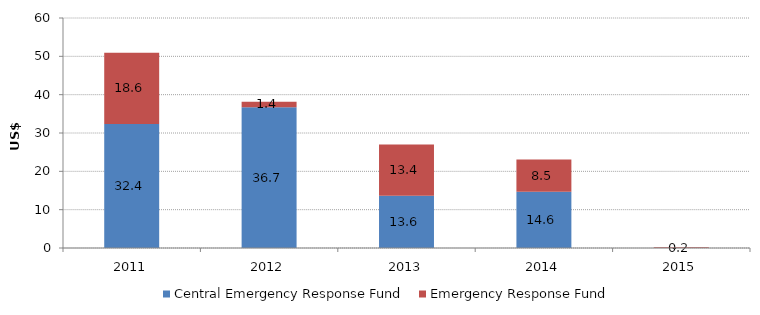
| Category | Central Emergency Response Fund | Emergency Response Fund  |
|---|---|---|
| 2011.0 | 32.371 | 18.582 |
| 2012.0 | 36.737 | 1.42 |
| 2013.0 | 13.622 | 13.36 |
| 2014.0 | 14.646 | 8.47 |
| 2015.0 | 0 | 0.205 |